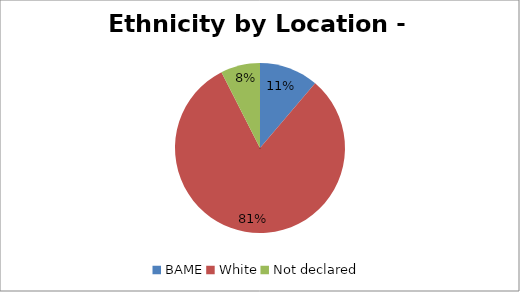
| Category | Series 0 |
|---|---|
| BAME | 69 |
| White | 499 |
| Not declared | 46 |